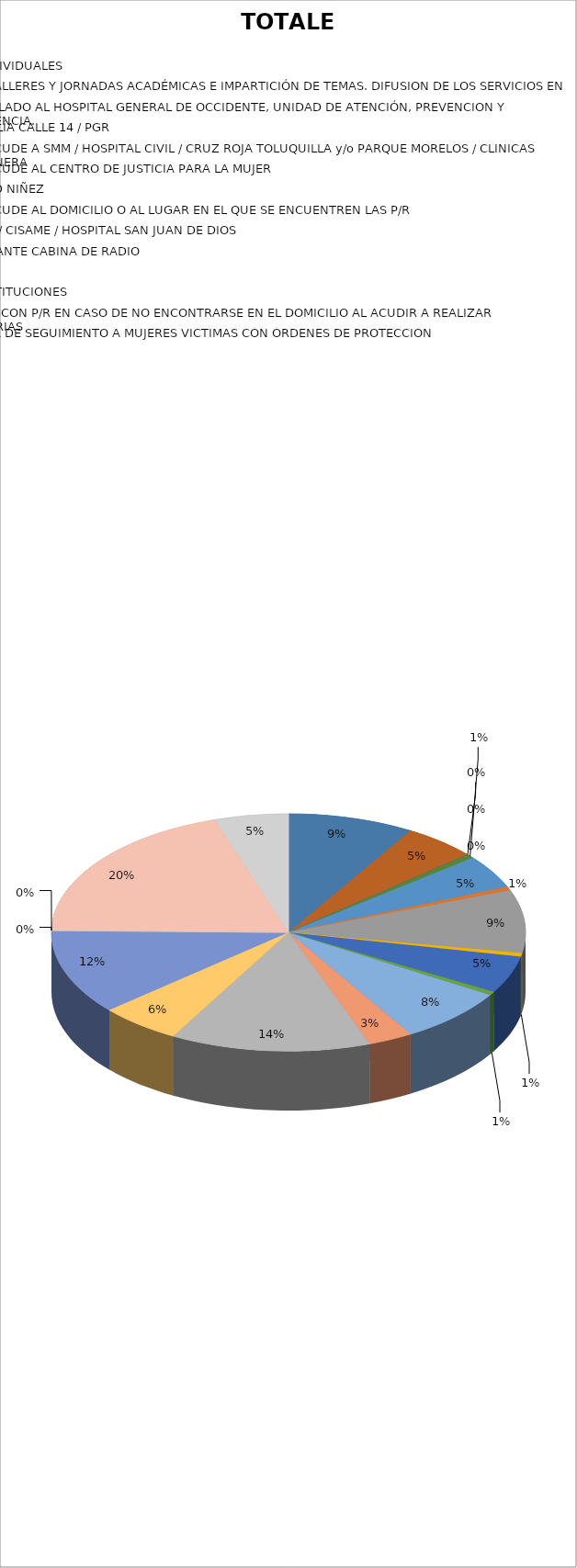
| Category | TOTALES |
|---|---|
| ASESORIAS JURÍDICAS | 17 |
| TERAPIAS PSICOLÓGICAS INDIVIDUALES | 10 |
| ACUDIR A CONFERENCIAS, TALLERES Y JORNADAS ACADÉMICAS E IMPARTICIÓN DE TEMAS. DIFUSION DE LOS SERVICIOS EN LAS COLONIAS | 0 |
| ACOMPAÑAMIENTO Y/O TRASLADO AL HOSPITAL GENERAL DE OCCIDENTE, UNIDAD DE ATENCIÓN, PREVENCION Y REHABILITACION DE LA VIOLENCIA. | 0 |
| ACOMPAÑAMIENTOS A FISCALÍA CALLE 14 / PGR | 0 |
| ACOMPAÑAMIENTO Y/O SE ACUDE A SMM / HOSPITAL CIVIL / CRUZ ROJA TOLUQUILLA y/o PARQUE MORELOS / CLINICAS IMSS / IJCF / CENTRAL CAMIONERA | 1 |
| ACOMPAÑAMIENTO Y/O SE ACUDE AL CENTRO DE JUSTICIA PARA LA MUJER | 9 |
| ACOMPAÑAMIENTO A CIUDAD NIÑEZ  | 1 |
| ACOMPAÑAMIENTO Y/O SE ACUDE AL DOMICILIO O AL LUGAR EN EL QUE SE ENCUENTREN LAS P/R | 17 |
| ACOMPAÑAMIENTO A SALME / CISAME / HOSPITAL SAN JUAN DE DIOS | 1 |
| SERVICIOS DERIVADOS MEDIANTE CABINA DE RADIO | 10 |
| CANALIZACIÓN INTERNA | 1 |
| CANALIZACIÓN A OTRAS INSTITUCIONES | 15 |
| COMUNICACIÓN TELEFONICA CON P/R EN CASO DE NO ENCONTRARSE EN EL DOMICILIO AL ACUDIR A REALIZAR INTERVENCIONES DOMICILIARIAS  | 6 |
| INTERVENCIÓN DOMICILIARIA DE SEGUIMIENTO A MUJERES VICTIMAS CON ORDENES DE PROTECCION  | 27 |
| VISITAS DOMICILIARIAS  | 11 |
| VISITAS DOMICILIARIAS DE NOTIFICACIONES DE LAS ORDENES DE PROTECCIÓN A DENUNCIADOS | 23 |
| ATENCIONES Y AUXILIO PSICOLÓGICO | 0 |
| ENTREGA DE DISPOSITIVO "PULSO DE VIDA" | 0 |
| CAMPAÑA "OPERATIVO NAVIDEÑO 2019" | 39 |
| PERSONAS QUE INGRESAN AL ALBERGUE DEL DIF MUNICIPAL PARA RESGUARDO | 10 |